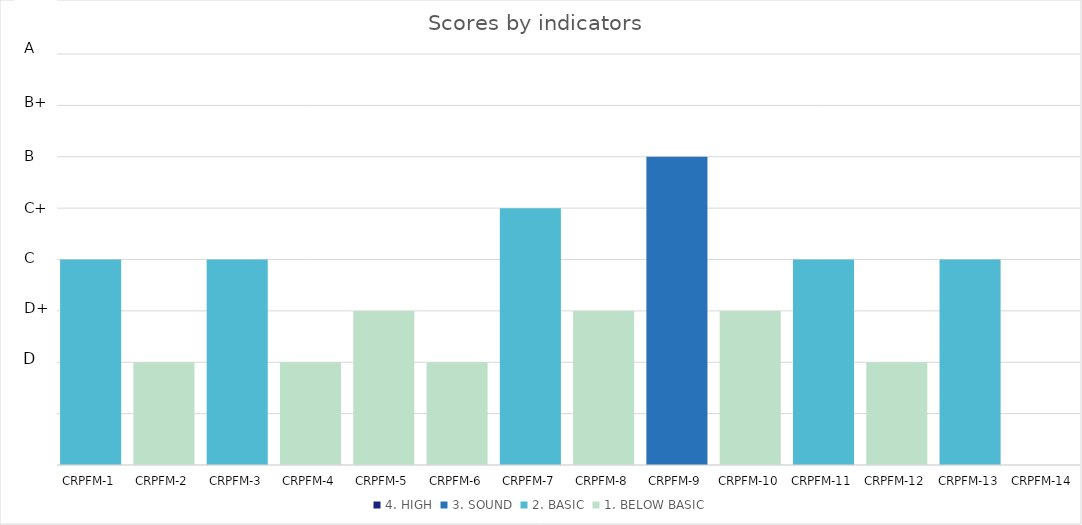
| Category | 4. HIGH | 3. SOUND | 2. BASIC | 1. BELOW BASIC |
|---|---|---|---|---|
| CRPFM-1 | 0 | 0 | 2 | 0 |
| CRPFM-2 | 0 | 0 | 0 | 1 |
| CRPFM-3 | 0 | 0 | 2 | 0 |
| CRPFM-4 | 0 | 0 | 0 | 1 |
| CRPFM-5 | 0 | 0 | 0 | 1.5 |
| CRPFM-6 | 0 | 0 | 0 | 1 |
| CRPFM-7 | 0 | 0 | 2.5 | 0 |
| CRPFM-8 | 0 | 0 | 0 | 1.5 |
| CRPFM-9 | 0 | 3 | 0 | 0 |
| CRPFM-10 | 0 | 0 | 0 | 1.5 |
| CRPFM-11 | 0 | 0 | 2 | 0 |
| CRPFM-12 | 0 | 0 | 0 | 1 |
| CRPFM-13 | 0 | 0 | 2 | 0 |
| CRPFM-14 | 0 | 0 | 0 | 0 |